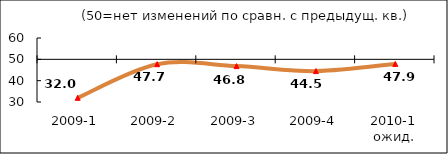
| Category | Диф.индекс ↓ |
|---|---|
| 2009-1 | 31.96 |
| 2009-2 | 47.725 |
| 2009-3 | 46.82 |
| 2009-4 | 44.48 |
| 2010-1 ожид. | 47.865 |